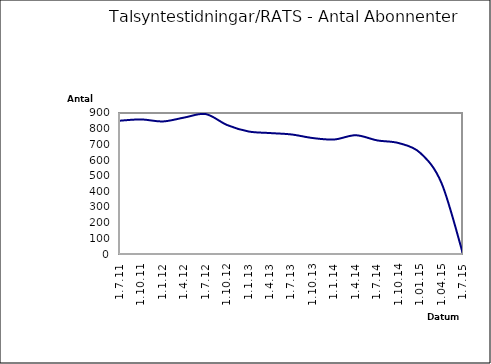
| Category | Series 0 |
|---|---|
| 1.7.11 | 851 |
| 1.10.11 | 859 |
| 1.1.12 | 846 |
| 1.4.12 | 871 |
| 1.7.12 | 893 |
| 1.10.12 | 823 |
| 1.1.13 | 782 |
| 1.4.13 | 772 |
| 1.7.13 | 763 |
| 1.10.13 | 740 |
| 1.1.14 | 731 |
| 1.4.14 | 758 |
| 1.7.14 | 725 |
| 1.10.14 | 708 |
| 1.01.15 | 646 |
| 1.04.15 | 452 |
| 1.7.15 | 0 |